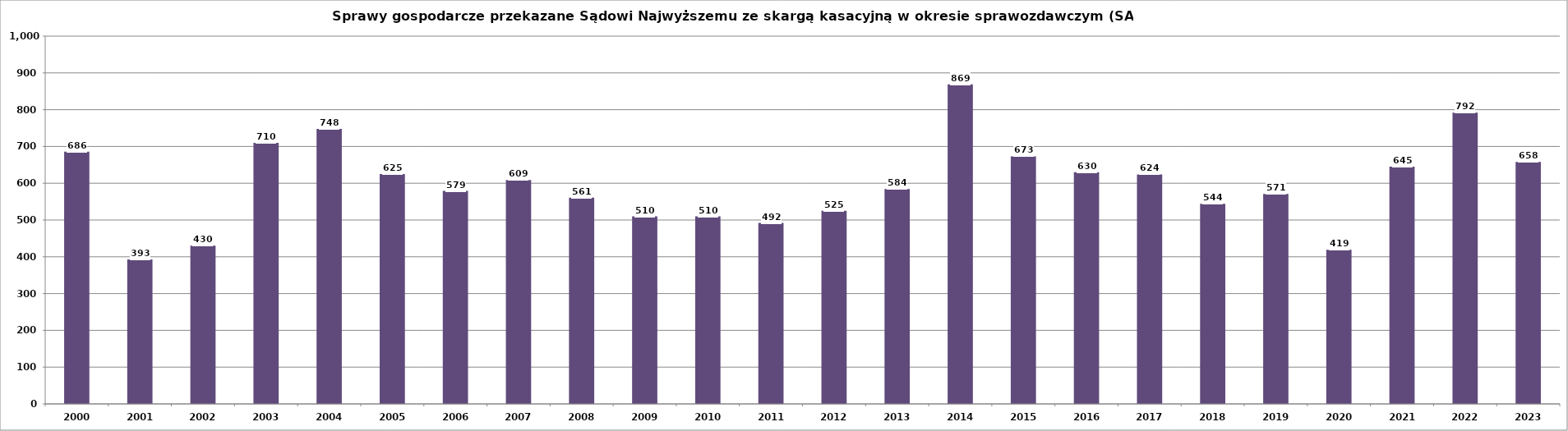
| Category | Series 0 |
|---|---|
| 2000.0 | 686 |
| 2001.0 | 393 |
| 2002.0 | 430 |
| 2003.0 | 710 |
| 2004.0 | 748 |
| 2005.0 | 625 |
| 2006.0 | 579 |
| 2007.0 | 609 |
| 2008.0 | 561 |
| 2009.0 | 510 |
| 2010.0 | 510 |
| 2011.0 | 492 |
| 2012.0 | 525 |
| 2013.0 | 584 |
| 2014.0 | 869 |
| 2015.0 | 673 |
| 2016.0 | 630 |
| 2017.0 | 624 |
| 2018.0 | 544 |
| 2019.0 | 571 |
| 2020.0 | 419 |
| 2021.0 | 645 |
| 2022.0 | 792 |
| 2023.0 | 658 |